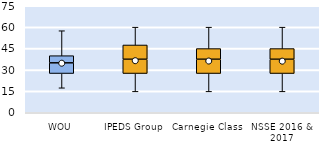
| Category | 25th | 50th | 75th |
|---|---|---|---|
| WOU | 27.5 | 7.5 | 5 |
| IPEDS Group | 27.5 | 10 | 10 |
| Carnegie Class | 27.5 | 10 | 7.5 |
| NSSE 2016 & 2017 | 27.5 | 10 | 7.5 |